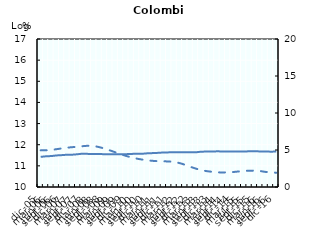
| Category | Tendencia |
|---|---|
| 0 | 11.424 |
| Jan-00 | 11.452 |
| Jan-00 | 11.464 |
| Jan-00 | 11.493 |
| Jan-00 | 11.509 |
| Jan-00 | 11.527 |
| Jan-00 | 11.531 |
| Jan-00 | 11.553 |
| Jan-00 | 11.578 |
| Jan-00 | 11.563 |
| Jan-00 | 11.563 |
| Jan-00 | 11.562 |
| Jan-00 | 11.547 |
| Jan-00 | 11.544 |
| Jan-00 | 11.546 |
| Jan-00 | 11.55 |
| Jan-00 | 11.553 |
| Jan-00 | 11.565 |
| Jan-00 | 11.573 |
| Jan-00 | 11.574 |
| Jan-00 | 11.594 |
| Jan-00 | 11.604 |
| Jan-00 | 11.616 |
| Jan-00 | 11.634 |
| Jan-00 | 11.638 |
| Jan-00 | 11.643 |
| Jan-00 | 11.639 |
| Jan-00 | 11.64 |
| Jan-00 | 11.645 |
| Jan-00 | 11.644 |
| Jan-00 | 11.67 |
| Jan-00 | 11.675 |
| Feb-00 | 11.678 |
| Feb-00 | 11.686 |
| Feb-00 | 11.681 |
| Feb-00 | 11.681 |
| Feb-00 | 11.68 |
| Feb-00 | 11.679 |
| Feb-00 | 11.679 |
| Feb-00 | 11.688 |
| Feb-00 | 11.688 |
| Feb-00 | 11.683 |
| Feb-00 | 11.681 |
| Feb-00 | 11.672 |
| Feb-00 | 11.678 |